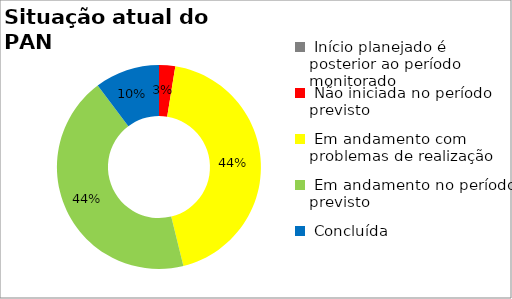
| Category | Series 0 |
|---|---|
|  Início planejado é posterior ao período monitorado | 0 |
|  Não iniciada no período previsto | 0.026 |
|  Em andamento com problemas de realização | 0.436 |
|  Em andamento no período previsto  | 0.436 |
|  Concluída | 0.103 |